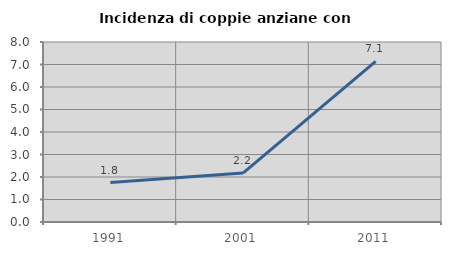
| Category | Incidenza di coppie anziane con figli |
|---|---|
| 1991.0 | 1.754 |
| 2001.0 | 2.174 |
| 2011.0 | 7.143 |